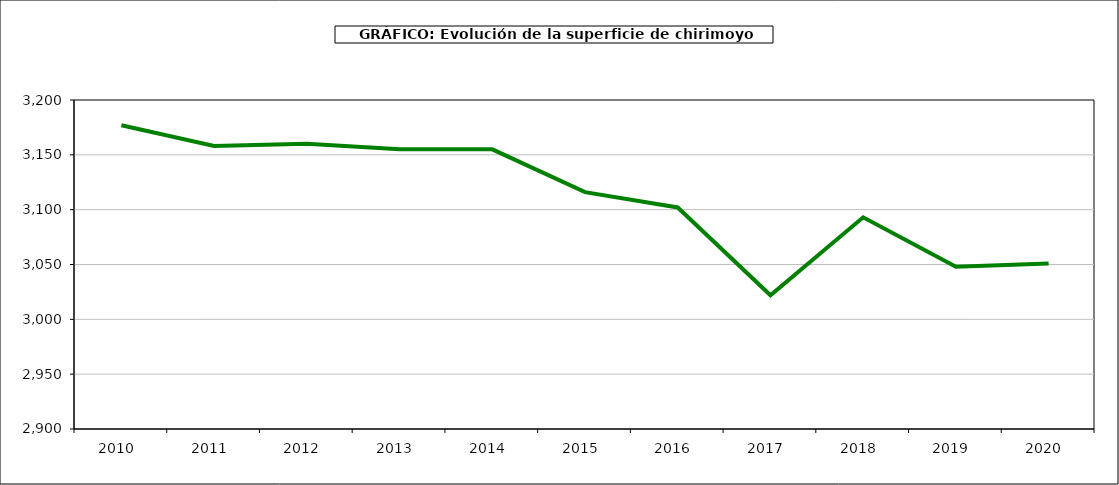
| Category | superficie chirimoyo |
|---|---|
| 2010.0 | 3177 |
| 2011.0 | 3158 |
| 2012.0 | 3160 |
| 2013.0 | 3155 |
| 2014.0 | 3155 |
| 2015.0 | 3116 |
| 2016.0 | 3102 |
| 2017.0 | 3022 |
| 2018.0 | 3093 |
| 2019.0 | 3048 |
| 2020.0 | 3051 |